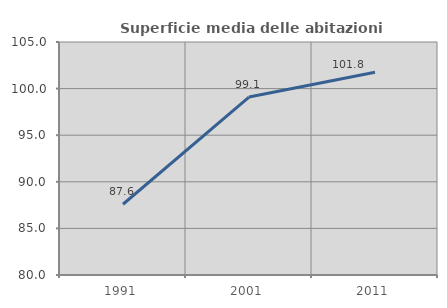
| Category | Superficie media delle abitazioni occupate |
|---|---|
| 1991.0 | 87.591 |
| 2001.0 | 99.095 |
| 2011.0 | 101.75 |